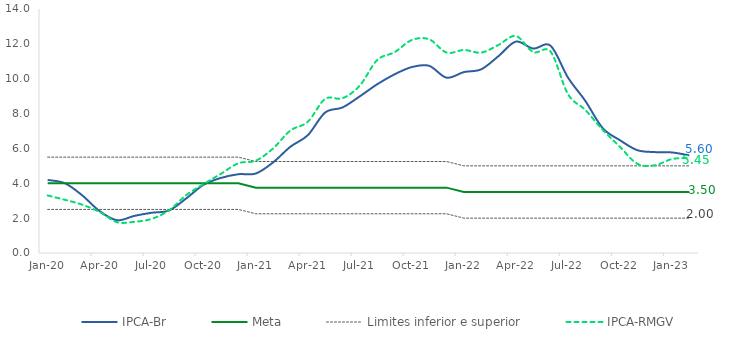
| Category | IPCA-Br | Meta | Limites inferior e superior | Limite superior | IPCA-RMGV |
|---|---|---|---|---|---|
| 2020-01-01 | 4.19 | 4 | 2.5 | 5.5 | 3.3 |
| 2020-02-01 | 4 | 4 | 2.5 | 5.5 | 3.05 |
| 2020-03-01 | 3.3 | 4 | 2.5 | 5.5 | 2.77 |
| 2020-04-01 | 2.4 | 4 | 2.5 | 5.5 | 2.35 |
| 2020-05-01 | 1.88 | 4 | 2.5 | 5.5 | 1.77 |
| 2020-06-01 | 2.13 | 4 | 2.5 | 5.5 | 1.79 |
| 2020-07-01 | 2.31 | 4 | 2.5 | 5.5 | 1.96 |
| 2020-08-01 | 2.44 | 4 | 2.5 | 5.5 | 2.45 |
| 2020-09-01 | 3.14 | 4 | 2.5 | 5.5 | 3.33 |
| 2020-10-01 | 3.92 | 4 | 2.5 | 5.5 | 3.96 |
| 2020-11-01 | 4.31 | 4 | 2.5 | 5.5 | 4.55 |
| 2020-12-01 | 4.52 | 4 | 2.5 | 5.5 | 5.15 |
| 2021-01-01 | 4.56 | 3.75 | 2.25 | 5.25 | 5.3 |
| 2021-02-01 | 5.2 | 3.75 | 2.25 | 5.25 | 6 |
| 2021-03-01 | 6.1 | 3.75 | 2.25 | 5.25 | 7.03 |
| 2021-04-01 | 6.76 | 3.75 | 2.25 | 5.25 | 7.53 |
| 2021-05-01 | 8.06 | 3.75 | 2.25 | 5.25 | 8.84 |
| 2021-06-01 | 8.35 | 3.75 | 2.25 | 5.25 | 8.88 |
| 2021-07-01 | 8.99 | 3.75 | 2.25 | 5.25 | 9.61 |
| 2021-08-01 | 9.68 | 3.75 | 2.25 | 5.25 | 11.07 |
| 2021-09-01 | 10.25 | 3.75 | 2.25 | 5.25 | 11.52 |
| 2021-10-01 | 10.67 | 3.75 | 2.25 | 5.25 | 12.22 |
| 2021-11-01 | 10.74 | 3.75 | 2.25 | 5.25 | 12.26 |
| 2021-12-01 | 10.06 | 3.75 | 2.25 | 5.25 | 11.5 |
| 2022-01-01 | 10.38 | 3.5 | 2 | 5 | 11.65 |
| 2022-02-01 | 10.54 | 3.5 | 2 | 5 | 11.5 |
| 2022-03-01 | 11.3 | 3.5 | 2 | 5 | 11.94 |
| 2022-04-01 | 12.13 | 3.5 | 2 | 5 | 12.45 |
| 2022-05-01 | 11.73 | 3.5 | 2 | 5 | 11.53 |
| 2022-06-01 | 11.89 | 3.5 | 2 | 5 | 11.55 |
| 2022-07-01 | 10.07 | 3.5 | 2 | 5 | 9.12 |
| 2022-08-01 | 8.73 | 3.5 | 2 | 5 | 8.21 |
| 2022-09-01 | 7.17 | 3.5 | 2 | 5 | 7.07 |
| 2022-10-01 | 6.47 | 3.5 | 2 | 5 | 6.09 |
| 2022-11-01 | 5.9 | 3.5 | 2 | 5 | 5.12 |
| 2022-12-01 | 5.79 | 3.5 | 2 | 5 | 5.03 |
| 2023-01-01 | 5.77 | 3.5 | 2 | 5 | 5.39 |
| 2023-02-01 | 5.6 | 3.5 | 2 | 5 | 5.45 |